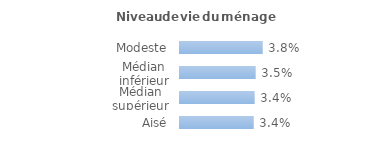
| Category | Series 0 |
|---|---|
| Modeste | 0.038 |
| Médian inférieur | 0.035 |
| Médian supérieur | 0.034 |
| Aisé | 0.034 |